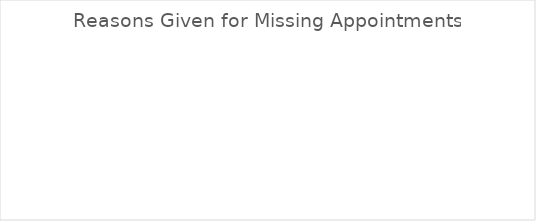
| Category | Series 0 |
|---|---|
| unknown - unable to reach family | 0 |
| forgot about appointment | 0 |
| child sick | 0 |
| work / school conflict | 0 |
| transportation difficulty | 0 |
| no longer in need of benefits | 0 |
| recently moved out of area | 0 |
| believed no longer eligible | 0 |
| dissatisfaction with program | 0 |
| fear due to immigration issues | 0 |
| using foodbank instead of WIC | 0 |
| no reason given | 0 |